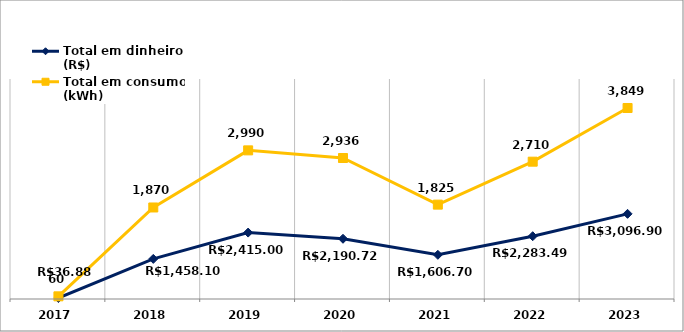
| Category | Total em dinheiro (R$) | Total em consumo (kWh) |
|---|---|---|
| 2017.0 | 36.88 | 60 |
| 2018.0 | 1458.1 | 1870 |
| 2019.0 | 2415 | 2990 |
| 2020.0 | 2190.72 | 2936 |
| 2021.0 | 1606.7 | 1825 |
| 2022.0 | 2283.49 | 2710 |
| 2023.0 | 3096.9 | 3849 |